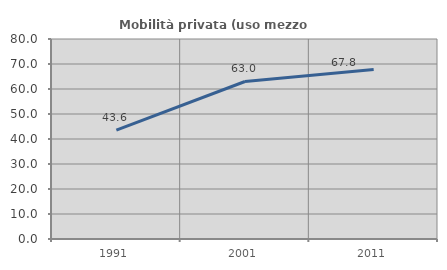
| Category | Mobilità privata (uso mezzo privato) |
|---|---|
| 1991.0 | 43.563 |
| 2001.0 | 63.002 |
| 2011.0 | 67.778 |